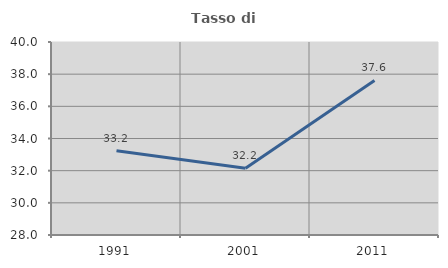
| Category | Tasso di occupazione   |
|---|---|
| 1991.0 | 33.243 |
| 2001.0 | 32.157 |
| 2011.0 | 37.611 |